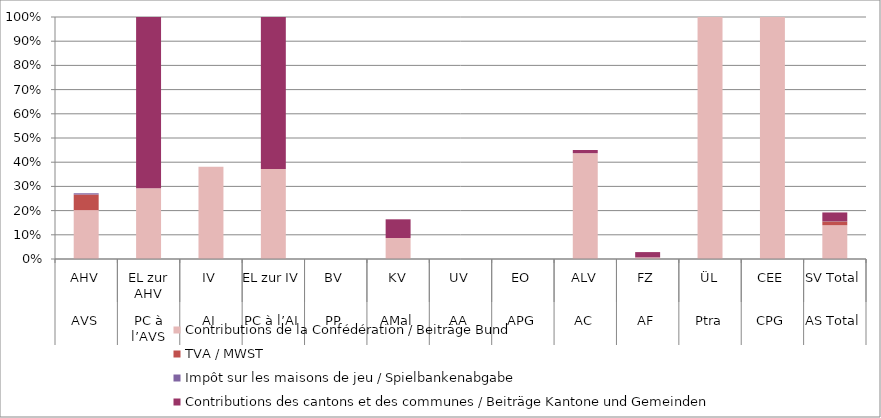
| Category | Contributions de la Confédération / Beiträge Bund | TVA / MWST | Impôt sur les maisons de jeu / Spielbankenabgabe | Contributions des cantons et des communes / Beiträge Kantone und Gemeinden |
|---|---|---|---|---|
| 0 | 0.202 | 0.065 | 0.005 | 0 |
| 1 | 0.292 | 0 | 0 | 0.708 |
| 2 | 0.381 | 0 | 0 | 0 |
| 3 | 0.372 | 0 | 0 | 0.628 |
| 4 | 0 | 0 | 0 | 0 |
| 5 | 0.087 | 0 | 0 | 0.077 |
| 6 | 0 | 0 | 0 | 0 |
| 7 | 0 | 0 | 0 | 0 |
| 8 | 0.437 | 0 | 0 | 0.013 |
| 9 | 0.007 | 0 | 0 | 0.022 |
| 10 | 1 | 0 | 0 | 0 |
| 11 | 1 | 0 | 0 | 0 |
| 12 | 0.14 | 0.016 | 0.001 | 0.035 |